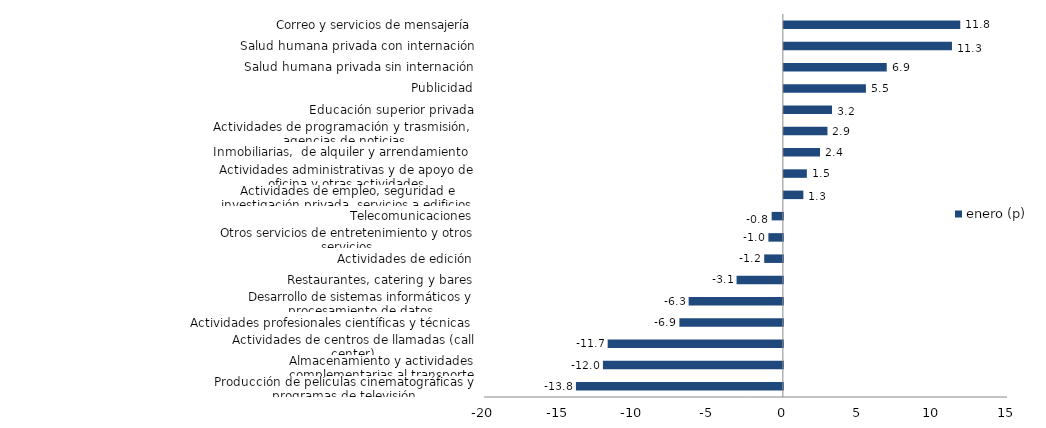
| Category | enero (p) |
|---|---|
| Producción de películas cinematográficas y programas de televisión | -13.848 |
| Almacenamiento y actividades complementarias al transporte | -12.041 |
| Actividades de centros de llamadas (call center) | -11.723 |
| Actividades profesionales científicas y técnicas  | -6.924 |
| Desarrollo de sistemas informáticos y procesamiento de datos | -6.305 |
| Restaurantes, catering y bares | -3.098 |
| Actividades de edición | -1.249 |
| Otros servicios de entretenimiento y otros servicios | -0.969 |
| Telecomunicaciones | -0.75 |
| Actividades de empleo, seguridad e investigación privada, servicios a edificios | 1.306 |
| Actividades administrativas y de apoyo de oficina y otras actividades | 1.539 |
| Inmobiliarias,  de alquiler y arrendamiento  | 2.42 |
| Actividades de programación y trasmisión,  agencias de noticias | 2.916 |
| Educación superior privada | 3.223 |
| Publicidad | 5.49 |
| Salud humana privada sin internación | 6.886 |
| Salud humana privada con internación | 11.251 |
| Correo y servicios de mensajería | 11.806 |